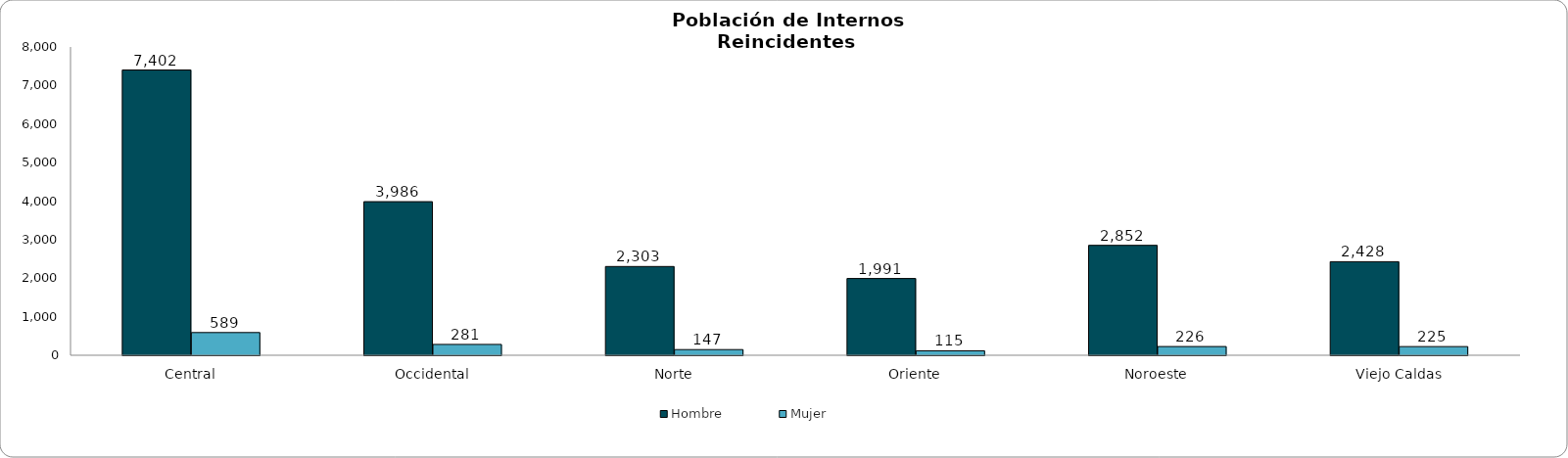
| Category | Hombre | Mujer |
|---|---|---|
| Central | 7402 | 589 |
| Occidental | 3986 | 281 |
| Norte | 2303 | 147 |
| Oriente | 1991 | 115 |
| Noroeste | 2852 | 226 |
| Viejo Caldas | 2428 | 225 |